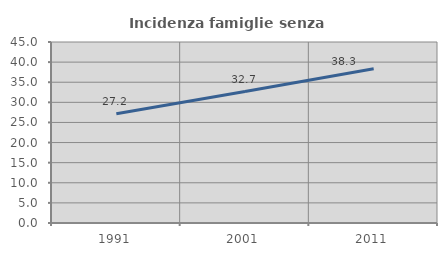
| Category | Incidenza famiglie senza nuclei |
|---|---|
| 1991.0 | 27.175 |
| 2001.0 | 32.686 |
| 2011.0 | 38.326 |